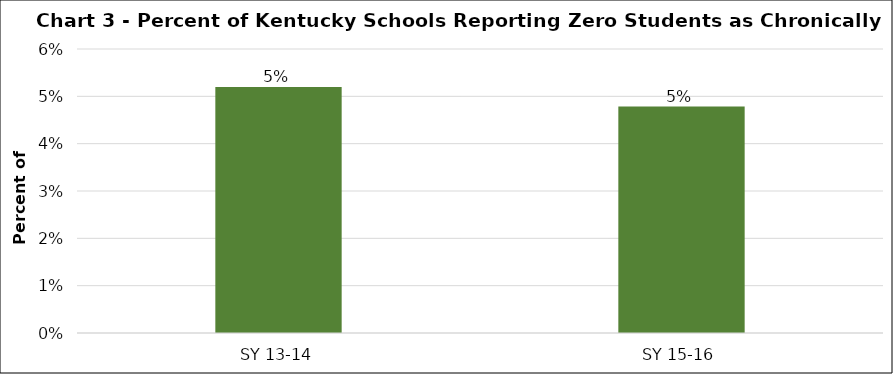
| Category | Series 0 |
|---|---|
| SY 13-14 | 0.052 |
| SY 15-16 | 0.048 |